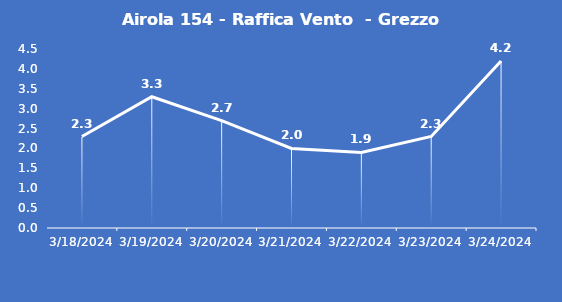
| Category | Airola 154 - Raffica Vento  - Grezzo (m/s) |
|---|---|
| 3/18/24 | 2.3 |
| 3/19/24 | 3.3 |
| 3/20/24 | 2.7 |
| 3/21/24 | 2 |
| 3/22/24 | 1.9 |
| 3/23/24 | 2.3 |
| 3/24/24 | 4.2 |